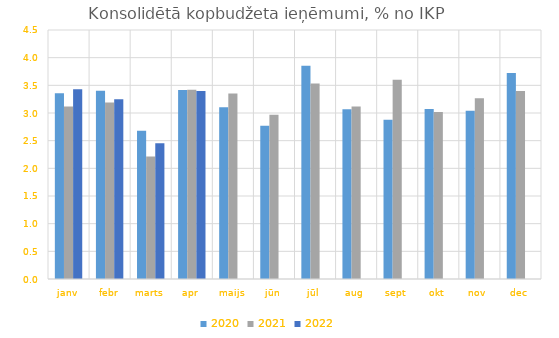
| Category | 2020 | 2021 | 2022 |
|---|---|---|---|
| janv | 3.356 | 3.116 | 3.427 |
| febr | 3.402 | 3.19 | 3.249 |
| marts | 2.68 | 2.216 | 2.454 |
| apr | 3.417 | 3.42 | 3.397 |
| maijs | 3.103 | 3.354 | 0 |
| jūn | 2.77 | 2.967 | 0 |
| jūl | 3.854 | 3.532 | 0 |
| aug | 3.069 | 3.116 | 0 |
| sept | 2.876 | 3.6 | 0 |
| okt | 3.071 | 3.018 | 0 |
| nov | 3.04 | 3.266 | 0 |
| dec | 3.723 | 3.399 | 0 |